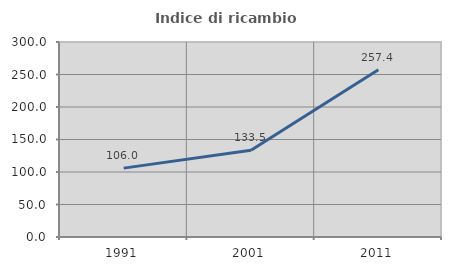
| Category | Indice di ricambio occupazionale  |
|---|---|
| 1991.0 | 105.977 |
| 2001.0 | 133.527 |
| 2011.0 | 257.424 |